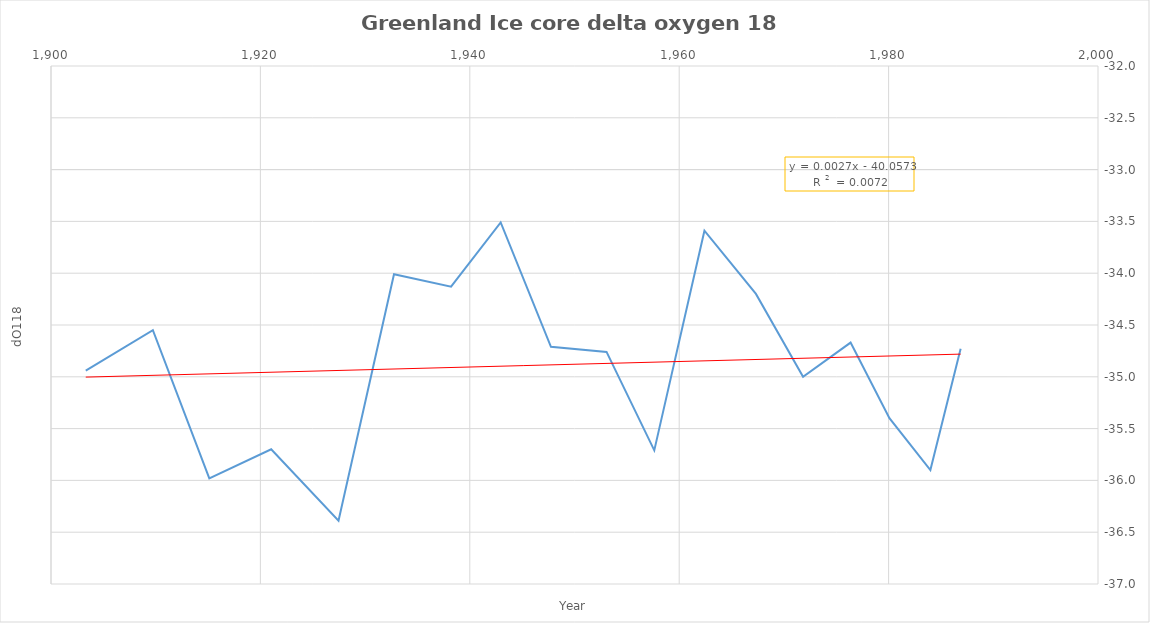
| Category | Series 0 |
|---|---|
| 1986.88 | -34.73 |
| 1983.99 | -35.9 |
| 1980.08 | -35.4 |
| 1976.37 | -34.67 |
| 1971.83 | -35 |
| 1967.33 | -34.2 |
| 1962.41 | -33.59 |
| 1957.62 | -35.71 |
| 1953.06 | -34.76 |
| 1947.75 | -34.71 |
| 1942.95 | -33.51 |
| 1938.21 | -34.13 |
| 1932.76 | -34.01 |
| 1927.46 | -36.39 |
| 1921.03 | -35.7 |
| 1915.12 | -35.98 |
| 1909.73 | -34.55 |
| 1903.32 | -34.94 |